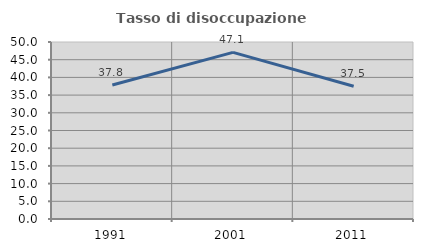
| Category | Tasso di disoccupazione giovanile  |
|---|---|
| 1991.0 | 37.838 |
| 2001.0 | 47.059 |
| 2011.0 | 37.5 |